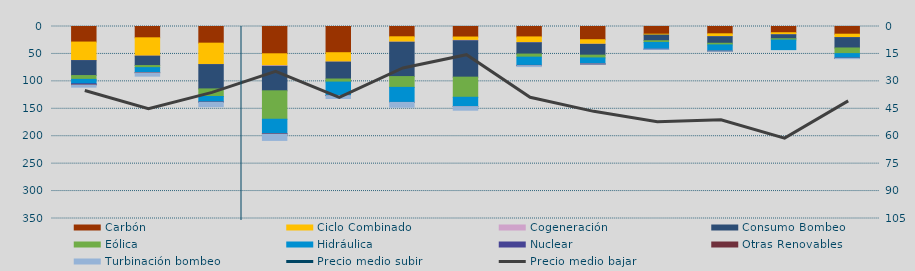
| Category | Carbón | Ciclo Combinado | Cogeneración | Consumo Bombeo | Eólica | Hidráulica | Nuclear | Otras Renovables | Turbinación bombeo |
|---|---|---|---|---|---|---|---|---|---|
| O | 28352.7 | 33701.8 | 72.5 | 27285.6 | 6968.9 | 8057.2 | 1524.1 | 736.2 | 3817.1 |
| N | 20637.7 | 33409.3 | 40.8 | 17072.8 | 3847.5 | 8820.4 | 0 | 757.7 | 5932.4 |
| D | 30371.3 | 38818.7 | 239.5 | 44331.3 | 13873.3 | 10280.7 | 108.3 | 133.8 | 8046.3 |
| E | 49749 | 21689 | 1091.7 | 44705.2 | 51833.3 | 26560.6 | 159.6 | 521.7 | 11348.4 |
| F | 47780.9 | 17066.1 | 83.8 | 30784 | 5603.4 | 24359.1 | 40 | 286.6 | 5220.7 |
| M | 18764.1 | 9673.8 | 444.5 | 62414.7 | 19679.2 | 27422.5 | 0 | 20.9 | 8766.8 |
| A | 19179.5 | 6106.3 | 488.3 | 66560.4 | 36687.3 | 16841.6 | 0 | 122 | 6609.5 |
| M | 18994.1 | 10277 | 353.4 | 20633.9 | 5611.8 | 15058.8 | 96.2 | 322.7 | 1709.2 |
| J | 24116.3 | 8196.7 | 265.7 | 19665.3 | 5033.9 | 11035.4 | 68.9 | 6.7 | 99.1 |
| J | 14004.7 | 1618.9 | 0 | 10261.3 | 3196.4 | 12305.1 | 26 | 0 | 119 |
| A | 13306.6 | 5191.1 | 57.6 | 12019.4 | 2979.3 | 11389.1 | 0 | 6.3 | 169.4 |
| S | 11365.6 | 3650 | 17 | 7271.8 | 2373.2 | 17475.2 | 0 | 0 | 0 |
| O | 14046.3 | 6143.3 | 63.6 | 18912.3 | 10240.2 | 8461.2 | 80 | 59 | 580.2 |